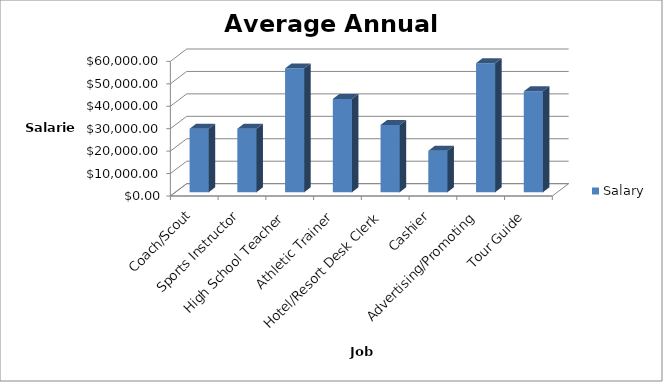
| Category | Salary |
|---|---|
| Coach/Scout | 28340 |
| Sports Instructor | 28340 |
| High School Teacher | 55230 |
| Athletic Trainer | 41600 |
| Hotel/Resort Desk Clerk | 29990 |
| Cashier | 18500 |
| Advertising/Promoting | 57550 |
| Tour Guide | 45000 |